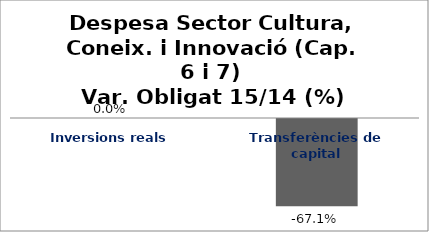
| Category | Series 0 |
|---|---|
| Inversions reals | 0 |
| Transferències de capital | -0.671 |